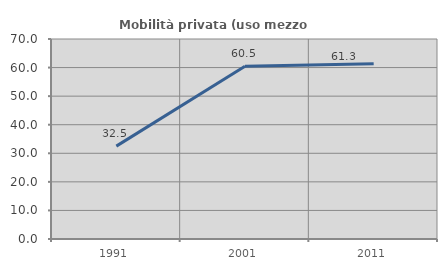
| Category | Mobilità privata (uso mezzo privato) |
|---|---|
| 1991.0 | 32.5 |
| 2001.0 | 60.465 |
| 2011.0 | 61.333 |